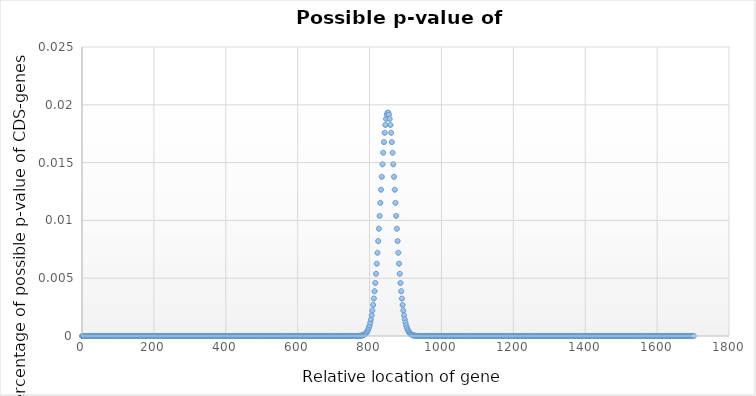
| Category | p-value of CDS |
|---|---|
| 0.0 | 0 |
| 2.0 | 0 |
| 4.0 | 0 |
| 6.0 | 0 |
| 8.0 | 0 |
| 10.0 | 0 |
| 12.0 | 0 |
| 14.0 | 0 |
| 16.0 | 0 |
| 18.0 | 0 |
| 20.0 | 0 |
| 22.0 | 0 |
| 24.0 | 0 |
| 26.0 | 0 |
| 28.0 | 0 |
| 30.0 | 0 |
| 32.0 | 0 |
| 34.0 | 0 |
| 36.0 | 0 |
| 38.0 | 0 |
| 40.0 | 0 |
| 42.0 | 0 |
| 44.0 | 0 |
| 46.0 | 0 |
| 48.0 | 0 |
| 50.0 | 0 |
| 52.0 | 0 |
| 54.0 | 0 |
| 56.0 | 0 |
| 58.0 | 0 |
| 60.0 | 0 |
| 62.0 | 0 |
| 64.0 | 0 |
| 66.0 | 0 |
| 68.0 | 0 |
| 70.0 | 0 |
| 72.0 | 0 |
| 74.0 | 0 |
| 76.0 | 0 |
| 78.0 | 0 |
| 80.0 | 0 |
| 82.0 | 0 |
| 84.0 | 0 |
| 86.0 | 0 |
| 88.0 | 0 |
| 90.0 | 0 |
| 92.0 | 0 |
| 94.0 | 0 |
| 96.0 | 0 |
| 98.0 | 0 |
| 100.0 | 0 |
| 102.0 | 0 |
| 104.0 | 0 |
| 106.0 | 0 |
| 108.0 | 0 |
| 110.0 | 0 |
| 112.0 | 0 |
| 114.0 | 0 |
| 116.0 | 0 |
| 118.0 | 0 |
| 120.0 | 0 |
| 122.0 | 0 |
| 124.0 | 0 |
| 126.0 | 0 |
| 128.0 | 0 |
| 130.0 | 0 |
| 132.0 | 0 |
| 134.0 | 0 |
| 136.0 | 0 |
| 138.0 | 0 |
| 140.0 | 0 |
| 142.0 | 0 |
| 144.0 | 0 |
| 146.0 | 0 |
| 148.0 | 0 |
| 150.0 | 0 |
| 152.0 | 0 |
| 154.0 | 0 |
| 156.0 | 0 |
| 158.0 | 0 |
| 160.0 | 0 |
| 162.0 | 0 |
| 164.0 | 0 |
| 166.0 | 0 |
| 168.0 | 0 |
| 170.0 | 0 |
| 172.0 | 0 |
| 174.0 | 0 |
| 176.0 | 0 |
| 178.0 | 0 |
| 180.0 | 0 |
| 182.0 | 0 |
| 184.0 | 0 |
| 186.0 | 0 |
| 188.0 | 0 |
| 190.0 | 0 |
| 192.0 | 0 |
| 194.0 | 0 |
| 196.0 | 0 |
| 198.0 | 0 |
| 200.0 | 0 |
| 202.0 | 0 |
| 204.0 | 0 |
| 206.0 | 0 |
| 208.0 | 0 |
| 210.0 | 0 |
| 212.0 | 0 |
| 214.0 | 0 |
| 216.0 | 0 |
| 218.0 | 0 |
| 220.0 | 0 |
| 222.0 | 0 |
| 224.0 | 0 |
| 226.0 | 0 |
| 228.0 | 0 |
| 230.0 | 0 |
| 232.0 | 0 |
| 234.0 | 0 |
| 236.0 | 0 |
| 238.0 | 0 |
| 240.0 | 0 |
| 242.0 | 0 |
| 244.0 | 0 |
| 246.0 | 0 |
| 248.0 | 0 |
| 250.0 | 0 |
| 252.0 | 0 |
| 254.0 | 0 |
| 256.0 | 0 |
| 258.0 | 0 |
| 260.0 | 0 |
| 262.0 | 0 |
| 264.0 | 0 |
| 266.0 | 0 |
| 268.0 | 0 |
| 270.0 | 0 |
| 272.0 | 0 |
| 274.0 | 0 |
| 276.0 | 0 |
| 278.0 | 0 |
| 280.0 | 0 |
| 282.0 | 0 |
| 284.0 | 0 |
| 286.0 | 0 |
| 288.0 | 0 |
| 290.0 | 0 |
| 292.0 | 0 |
| 294.0 | 0 |
| 296.0 | 0 |
| 298.0 | 0 |
| 300.0 | 0 |
| 302.0 | 0 |
| 304.0 | 0 |
| 306.0 | 0 |
| 308.0 | 0 |
| 310.0 | 0 |
| 312.0 | 0 |
| 314.0 | 0 |
| 316.0 | 0 |
| 318.0 | 0 |
| 320.0 | 0 |
| 322.0 | 0 |
| 324.0 | 0 |
| 326.0 | 0 |
| 328.0 | 0 |
| 330.0 | 0 |
| 332.0 | 0 |
| 334.0 | 0 |
| 336.0 | 0 |
| 338.0 | 0 |
| 340.0 | 0 |
| 342.0 | 0 |
| 344.0 | 0 |
| 346.0 | 0 |
| 348.0 | 0 |
| 350.0 | 0 |
| 352.0 | 0 |
| 354.0 | 0 |
| 356.0 | 0 |
| 358.0 | 0 |
| 360.0 | 0 |
| 362.0 | 0 |
| 364.0 | 0 |
| 366.0 | 0 |
| 368.0 | 0 |
| 370.0 | 0 |
| 372.0 | 0 |
| 374.0 | 0 |
| 376.0 | 0 |
| 378.0 | 0 |
| 380.0 | 0 |
| 382.0 | 0 |
| 384.0 | 0 |
| 386.0 | 0 |
| 388.0 | 0 |
| 390.0 | 0 |
| 392.0 | 0 |
| 394.0 | 0 |
| 396.0 | 0 |
| 398.0 | 0 |
| 400.0 | 0 |
| 402.0 | 0 |
| 404.0 | 0 |
| 406.0 | 0 |
| 408.0 | 0 |
| 410.0 | 0 |
| 412.0 | 0 |
| 414.0 | 0 |
| 416.0 | 0 |
| 418.0 | 0 |
| 420.0 | 0 |
| 422.0 | 0 |
| 424.0 | 0 |
| 426.0 | 0 |
| 428.0 | 0 |
| 430.0 | 0 |
| 432.0 | 0 |
| 434.0 | 0 |
| 436.0 | 0 |
| 438.0 | 0 |
| 440.0 | 0 |
| 442.0 | 0 |
| 444.0 | 0 |
| 446.0 | 0 |
| 448.0 | 0 |
| 450.0 | 0 |
| 452.0 | 0 |
| 454.0 | 0 |
| 456.0 | 0 |
| 458.0 | 0 |
| 460.0 | 0 |
| 462.0 | 0 |
| 464.0 | 0 |
| 466.0 | 0 |
| 468.0 | 0 |
| 470.0 | 0 |
| 472.0 | 0 |
| 474.0 | 0 |
| 476.0 | 0 |
| 478.0 | 0 |
| 480.0 | 0 |
| 482.0 | 0 |
| 484.0 | 0 |
| 486.0 | 0 |
| 488.0 | 0 |
| 490.0 | 0 |
| 492.0 | 0 |
| 494.0 | 0 |
| 496.0 | 0 |
| 498.0 | 0 |
| 500.0 | 0 |
| 502.0 | 0 |
| 504.0 | 0 |
| 506.0 | 0 |
| 508.0 | 0 |
| 510.0 | 0 |
| 512.0 | 0 |
| 514.0 | 0 |
| 516.0 | 0 |
| 518.0 | 0 |
| 520.0 | 0 |
| 522.0 | 0 |
| 524.0 | 0 |
| 526.0 | 0 |
| 528.0 | 0 |
| 530.0 | 0 |
| 532.0 | 0 |
| 534.0 | 0 |
| 536.0 | 0 |
| 538.0 | 0 |
| 540.0 | 0 |
| 542.0 | 0 |
| 544.0 | 0 |
| 546.0 | 0 |
| 548.0 | 0 |
| 550.0 | 0 |
| 552.0 | 0 |
| 554.0 | 0 |
| 556.0 | 0 |
| 558.0 | 0 |
| 560.0 | 0 |
| 562.0 | 0 |
| 564.0 | 0 |
| 566.0 | 0 |
| 568.0 | 0 |
| 570.0 | 0 |
| 572.0 | 0 |
| 574.0 | 0 |
| 576.0 | 0 |
| 578.0 | 0 |
| 580.0 | 0 |
| 582.0 | 0 |
| 584.0 | 0 |
| 586.0 | 0 |
| 588.0 | 0 |
| 590.0 | 0 |
| 592.0 | 0 |
| 594.0 | 0 |
| 596.0 | 0 |
| 598.0 | 0 |
| 600.0 | 0 |
| 602.0 | 0 |
| 604.0 | 0 |
| 606.0 | 0 |
| 608.0 | 0 |
| 610.0 | 0 |
| 612.0 | 0 |
| 614.0 | 0 |
| 616.0 | 0 |
| 618.0 | 0 |
| 620.0 | 0 |
| 622.0 | 0 |
| 624.0 | 0 |
| 626.0 | 0 |
| 628.0 | 0 |
| 630.0 | 0 |
| 632.0 | 0 |
| 634.0 | 0 |
| 636.0 | 0 |
| 638.0 | 0 |
| 640.0 | 0 |
| 642.0 | 0 |
| 644.0 | 0 |
| 646.0 | 0 |
| 648.0 | 0 |
| 650.0 | 0 |
| 652.0 | 0 |
| 654.0 | 0 |
| 656.0 | 0 |
| 658.0 | 0 |
| 660.0 | 0 |
| 662.0 | 0 |
| 664.0 | 0 |
| 666.0 | 0 |
| 668.0 | 0 |
| 670.0 | 0 |
| 672.0 | 0 |
| 674.0 | 0 |
| 676.0 | 0 |
| 678.0 | 0 |
| 680.0 | 0 |
| 682.0 | 0 |
| 684.0 | 0 |
| 686.0 | 0 |
| 688.0 | 0 |
| 690.0 | 0 |
| 692.0 | 0 |
| 694.0 | 0 |
| 696.0 | 0 |
| 698.0 | 0 |
| 700.0 | 0 |
| 702.0 | 0 |
| 704.0 | 0 |
| 706.0 | 0 |
| 708.0 | 0 |
| 710.0 | 0 |
| 712.0 | 0 |
| 714.0 | 0 |
| 716.0 | 0 |
| 718.0 | 0 |
| 720.0 | 0 |
| 722.0 | 0 |
| 724.0 | 0 |
| 726.0 | 0 |
| 728.0 | 0 |
| 730.0 | 0 |
| 732.0 | 0 |
| 734.0 | 0 |
| 736.0 | 0 |
| 738.0 | 0 |
| 740.0 | 0 |
| 742.0 | 0 |
| 744.0 | 0 |
| 746.0 | 0 |
| 748.0 | 0 |
| 750.0 | 0 |
| 752.0 | 0 |
| 754.0 | 0 |
| 756.0 | 0 |
| 758.0 | 0 |
| 760.0 | 0 |
| 762.0 | 0 |
| 764.0 | 0 |
| 766.0 | 0 |
| 768.0 | 0 |
| 770.0 | 0 |
| 772.0 | 0 |
| 774.0 | 0 |
| 776.0 | 0 |
| 778.0 | 0 |
| 780.0 | 0 |
| 782.0 | 0 |
| 784.0 | 0 |
| 786.0 | 0 |
| 788.0 | 0 |
| 790.0 | 0 |
| 792.0 | 0 |
| 794.0 | 0 |
| 796.0 | 0.001 |
| 798.0 | 0.001 |
| 800.0 | 0.001 |
| 802.0 | 0.001 |
| 804.0 | 0.001 |
| 806.0 | 0.002 |
| 808.0 | 0.002 |
| 810.0 | 0.003 |
| 812.0 | 0.003 |
| 814.0 | 0.004 |
| 816.0 | 0.005 |
| 818.0 | 0.005 |
| 820.0 | 0.006 |
| 822.0 | 0.007 |
| 824.0 | 0.008 |
| 826.0 | 0.009 |
| 828.0 | 0.01 |
| 830.0 | 0.012 |
| 832.0 | 0.013 |
| 834.0 | 0.014 |
| 836.0 | 0.015 |
| 838.0 | 0.016 |
| 840.0 | 0.017 |
| 842.0 | 0.018 |
| 844.0 | 0.018 |
| 846.0 | 0.019 |
| 848.0 | 0.019 |
| 850.0 | 0.019 |
| 852.0 | 0.019 |
| 854.0 | 0.019 |
| 856.0 | 0.019 |
| 858.0 | 0.018 |
| 860.0 | 0.018 |
| 862.0 | 0.017 |
| 864.0 | 0.016 |
| 866.0 | 0.015 |
| 868.0 | 0.014 |
| 870.0 | 0.013 |
| 872.0 | 0.012 |
| 874.0 | 0.01 |
| 876.0 | 0.009 |
| 878.0 | 0.008 |
| 880.0 | 0.007 |
| 882.0 | 0.006 |
| 884.0 | 0.005 |
| 886.0 | 0.005 |
| 888.0 | 0.004 |
| 890.0 | 0.003 |
| 892.0 | 0.003 |
| 894.0 | 0.002 |
| 896.0 | 0.002 |
| 898.0 | 0.001 |
| 900.0 | 0.001 |
| 902.0 | 0.001 |
| 904.0 | 0.001 |
| 906.0 | 0.001 |
| 908.0 | 0 |
| 910.0 | 0 |
| 912.0 | 0 |
| 914.0 | 0 |
| 916.0 | 0 |
| 918.0 | 0 |
| 920.0 | 0 |
| 922.0 | 0 |
| 924.0 | 0 |
| 926.0 | 0 |
| 928.0 | 0 |
| 930.0 | 0 |
| 932.0 | 0 |
| 934.0 | 0 |
| 936.0 | 0 |
| 938.0 | 0 |
| 940.0 | 0 |
| 942.0 | 0 |
| 944.0 | 0 |
| 946.0 | 0 |
| 948.0 | 0 |
| 950.0 | 0 |
| 952.0 | 0 |
| 954.0 | 0 |
| 956.0 | 0 |
| 958.0 | 0 |
| 960.0 | 0 |
| 962.0 | 0 |
| 964.0 | 0 |
| 966.0 | 0 |
| 968.0 | 0 |
| 970.0 | 0 |
| 972.0 | 0 |
| 974.0 | 0 |
| 976.0 | 0 |
| 978.0 | 0 |
| 980.0 | 0 |
| 982.0 | 0 |
| 984.0 | 0 |
| 986.0 | 0 |
| 988.0 | 0 |
| 990.0 | 0 |
| 992.0 | 0 |
| 994.0 | 0 |
| 996.0 | 0 |
| 998.0 | 0 |
| 1000.0 | 0 |
| 1002.0 | 0 |
| 1004.0 | 0 |
| 1006.0 | 0 |
| 1008.0 | 0 |
| 1010.0 | 0 |
| 1012.0 | 0 |
| 1014.0 | 0 |
| 1016.0 | 0 |
| 1018.0 | 0 |
| 1020.0 | 0 |
| 1022.0 | 0 |
| 1024.0 | 0 |
| 1026.0 | 0 |
| 1028.0 | 0 |
| 1030.0 | 0 |
| 1032.0 | 0 |
| 1034.0 | 0 |
| 1036.0 | 0 |
| 1038.0 | 0 |
| 1040.0 | 0 |
| 1042.0 | 0 |
| 1044.0 | 0 |
| 1046.0 | 0 |
| 1048.0 | 0 |
| 1050.0 | 0 |
| 1052.0 | 0 |
| 1054.0 | 0 |
| 1056.0 | 0 |
| 1058.0 | 0 |
| 1060.0 | 0 |
| 1062.0 | 0 |
| 1064.0 | 0 |
| 1066.0 | 0 |
| 1068.0 | 0 |
| 1070.0 | 0 |
| 1072.0 | 0 |
| 1074.0 | 0 |
| 1076.0 | 0 |
| 1078.0 | 0 |
| 1080.0 | 0 |
| 1082.0 | 0 |
| 1084.0 | 0 |
| 1086.0 | 0 |
| 1088.0 | 0 |
| 1090.0 | 0 |
| 1092.0 | 0 |
| 1094.0 | 0 |
| 1096.0 | 0 |
| 1098.0 | 0 |
| 1100.0 | 0 |
| 1102.0 | 0 |
| 1104.0 | 0 |
| 1106.0 | 0 |
| 1108.0 | 0 |
| 1110.0 | 0 |
| 1112.0 | 0 |
| 1114.0 | 0 |
| 1116.0 | 0 |
| 1118.0 | 0 |
| 1120.0 | 0 |
| 1122.0 | 0 |
| 1124.0 | 0 |
| 1126.0 | 0 |
| 1128.0 | 0 |
| 1130.0 | 0 |
| 1132.0 | 0 |
| 1134.0 | 0 |
| 1136.0 | 0 |
| 1138.0 | 0 |
| 1140.0 | 0 |
| 1142.0 | 0 |
| 1144.0 | 0 |
| 1146.0 | 0 |
| 1148.0 | 0 |
| 1150.0 | 0 |
| 1152.0 | 0 |
| 1154.0 | 0 |
| 1156.0 | 0 |
| 1158.0 | 0 |
| 1160.0 | 0 |
| 1162.0 | 0 |
| 1164.0 | 0 |
| 1166.0 | 0 |
| 1168.0 | 0 |
| 1170.0 | 0 |
| 1172.0 | 0 |
| 1174.0 | 0 |
| 1176.0 | 0 |
| 1178.0 | 0 |
| 1180.0 | 0 |
| 1182.0 | 0 |
| 1184.0 | 0 |
| 1186.0 | 0 |
| 1188.0 | 0 |
| 1190.0 | 0 |
| 1192.0 | 0 |
| 1194.0 | 0 |
| 1196.0 | 0 |
| 1198.0 | 0 |
| 1200.0 | 0 |
| 1202.0 | 0 |
| 1204.0 | 0 |
| 1206.0 | 0 |
| 1208.0 | 0 |
| 1210.0 | 0 |
| 1212.0 | 0 |
| 1214.0 | 0 |
| 1216.0 | 0 |
| 1218.0 | 0 |
| 1220.0 | 0 |
| 1222.0 | 0 |
| 1224.0 | 0 |
| 1226.0 | 0 |
| 1228.0 | 0 |
| 1230.0 | 0 |
| 1232.0 | 0 |
| 1234.0 | 0 |
| 1236.0 | 0 |
| 1238.0 | 0 |
| 1240.0 | 0 |
| 1242.0 | 0 |
| 1244.0 | 0 |
| 1246.0 | 0 |
| 1248.0 | 0 |
| 1250.0 | 0 |
| 1252.0 | 0 |
| 1254.0 | 0 |
| 1256.0 | 0 |
| 1258.0 | 0 |
| 1260.0 | 0 |
| 1262.0 | 0 |
| 1264.0 | 0 |
| 1266.0 | 0 |
| 1268.0 | 0 |
| 1270.0 | 0 |
| 1272.0 | 0 |
| 1274.0 | 0 |
| 1276.0 | 0 |
| 1278.0 | 0 |
| 1280.0 | 0 |
| 1282.0 | 0 |
| 1284.0 | 0 |
| 1286.0 | 0 |
| 1288.0 | 0 |
| 1290.0 | 0 |
| 1292.0 | 0 |
| 1294.0 | 0 |
| 1296.0 | 0 |
| 1298.0 | 0 |
| 1300.0 | 0 |
| 1302.0 | 0 |
| 1304.0 | 0 |
| 1306.0 | 0 |
| 1308.0 | 0 |
| 1310.0 | 0 |
| 1312.0 | 0 |
| 1314.0 | 0 |
| 1316.0 | 0 |
| 1318.0 | 0 |
| 1320.0 | 0 |
| 1322.0 | 0 |
| 1324.0 | 0 |
| 1326.0 | 0 |
| 1328.0 | 0 |
| 1330.0 | 0 |
| 1332.0 | 0 |
| 1334.0 | 0 |
| 1336.0 | 0 |
| 1338.0 | 0 |
| 1340.0 | 0 |
| 1342.0 | 0 |
| 1344.0 | 0 |
| 1346.0 | 0 |
| 1348.0 | 0 |
| 1350.0 | 0 |
| 1352.0 | 0 |
| 1354.0 | 0 |
| 1356.0 | 0 |
| 1358.0 | 0 |
| 1360.0 | 0 |
| 1362.0 | 0 |
| 1364.0 | 0 |
| 1366.0 | 0 |
| 1368.0 | 0 |
| 1370.0 | 0 |
| 1372.0 | 0 |
| 1374.0 | 0 |
| 1376.0 | 0 |
| 1378.0 | 0 |
| 1380.0 | 0 |
| 1382.0 | 0 |
| 1384.0 | 0 |
| 1386.0 | 0 |
| 1388.0 | 0 |
| 1390.0 | 0 |
| 1392.0 | 0 |
| 1394.0 | 0 |
| 1396.0 | 0 |
| 1398.0 | 0 |
| 1400.0 | 0 |
| 1402.0 | 0 |
| 1404.0 | 0 |
| 1406.0 | 0 |
| 1408.0 | 0 |
| 1410.0 | 0 |
| 1412.0 | 0 |
| 1414.0 | 0 |
| 1416.0 | 0 |
| 1418.0 | 0 |
| 1420.0 | 0 |
| 1422.0 | 0 |
| 1424.0 | 0 |
| 1426.0 | 0 |
| 1428.0 | 0 |
| 1430.0 | 0 |
| 1432.0 | 0 |
| 1434.0 | 0 |
| 1436.0 | 0 |
| 1438.0 | 0 |
| 1440.0 | 0 |
| 1442.0 | 0 |
| 1444.0 | 0 |
| 1446.0 | 0 |
| 1448.0 | 0 |
| 1450.0 | 0 |
| 1452.0 | 0 |
| 1454.0 | 0 |
| 1456.0 | 0 |
| 1458.0 | 0 |
| 1460.0 | 0 |
| 1462.0 | 0 |
| 1464.0 | 0 |
| 1466.0 | 0 |
| 1468.0 | 0 |
| 1470.0 | 0 |
| 1472.0 | 0 |
| 1474.0 | 0 |
| 1476.0 | 0 |
| 1478.0 | 0 |
| 1480.0 | 0 |
| 1482.0 | 0 |
| 1484.0 | 0 |
| 1486.0 | 0 |
| 1488.0 | 0 |
| 1490.0 | 0 |
| 1492.0 | 0 |
| 1494.0 | 0 |
| 1496.0 | 0 |
| 1498.0 | 0 |
| 1500.0 | 0 |
| 1502.0 | 0 |
| 1504.0 | 0 |
| 1506.0 | 0 |
| 1508.0 | 0 |
| 1510.0 | 0 |
| 1512.0 | 0 |
| 1514.0 | 0 |
| 1516.0 | 0 |
| 1518.0 | 0 |
| 1520.0 | 0 |
| 1522.0 | 0 |
| 1524.0 | 0 |
| 1526.0 | 0 |
| 1528.0 | 0 |
| 1530.0 | 0 |
| 1532.0 | 0 |
| 1534.0 | 0 |
| 1536.0 | 0 |
| 1538.0 | 0 |
| 1540.0 | 0 |
| 1542.0 | 0 |
| 1544.0 | 0 |
| 1546.0 | 0 |
| 1548.0 | 0 |
| 1550.0 | 0 |
| 1552.0 | 0 |
| 1554.0 | 0 |
| 1556.0 | 0 |
| 1558.0 | 0 |
| 1560.0 | 0 |
| 1562.0 | 0 |
| 1564.0 | 0 |
| 1566.0 | 0 |
| 1568.0 | 0 |
| 1570.0 | 0 |
| 1572.0 | 0 |
| 1574.0 | 0 |
| 1576.0 | 0 |
| 1578.0 | 0 |
| 1580.0 | 0 |
| 1582.0 | 0 |
| 1584.0 | 0 |
| 1586.0 | 0 |
| 1588.0 | 0 |
| 1590.0 | 0 |
| 1592.0 | 0 |
| 1594.0 | 0 |
| 1596.0 | 0 |
| 1598.0 | 0 |
| 1600.0 | 0 |
| 1602.0 | 0 |
| 1604.0 | 0 |
| 1606.0 | 0 |
| 1608.0 | 0 |
| 1610.0 | 0 |
| 1612.0 | 0 |
| 1614.0 | 0 |
| 1616.0 | 0 |
| 1618.0 | 0 |
| 1620.0 | 0 |
| 1622.0 | 0 |
| 1624.0 | 0 |
| 1626.0 | 0 |
| 1628.0 | 0 |
| 1630.0 | 0 |
| 1632.0 | 0 |
| 1634.0 | 0 |
| 1636.0 | 0 |
| 1638.0 | 0 |
| 1640.0 | 0 |
| 1642.0 | 0 |
| 1644.0 | 0 |
| 1646.0 | 0 |
| 1648.0 | 0 |
| 1650.0 | 0 |
| 1652.0 | 0 |
| 1654.0 | 0 |
| 1656.0 | 0 |
| 1658.0 | 0 |
| 1660.0 | 0 |
| 1662.0 | 0 |
| 1664.0 | 0 |
| 1666.0 | 0 |
| 1668.0 | 0 |
| 1670.0 | 0 |
| 1672.0 | 0 |
| 1674.0 | 0 |
| 1676.0 | 0 |
| 1678.0 | 0 |
| 1680.0 | 0 |
| 1682.0 | 0 |
| 1684.0 | 0 |
| 1686.0 | 0 |
| 1688.0 | 0 |
| 1690.0 | 0 |
| 1692.0 | 0 |
| 1694.0 | 0 |
| 1696.0 | 0 |
| 1698.0 | 0 |
| 1700.0 | 0 |
| 1702.0 | 0 |